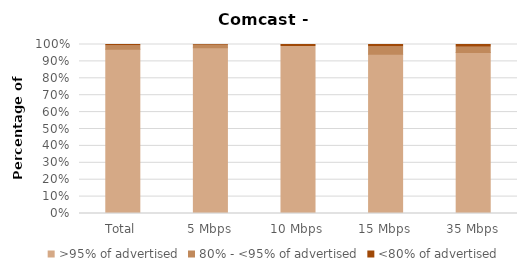
| Category | >95% of advertised | 80% - <95% of advertised | <80% of advertised |
|---|---|---|---|
| Total | 0.972 | 0.019 | 0.009 |
| 5 Mbps | 0.98 | 0.015 | 0.005 |
| 10 Mbps | 0.988 | 0 | 0.012 |
| 15 Mbps | 0.942 | 0.043 | 0.014 |
| 35 Mbps | 0.953 | 0.031 | 0.016 |